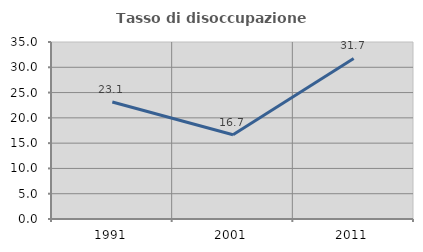
| Category | Tasso di disoccupazione giovanile  |
|---|---|
| 1991.0 | 23.148 |
| 2001.0 | 16.667 |
| 2011.0 | 31.746 |